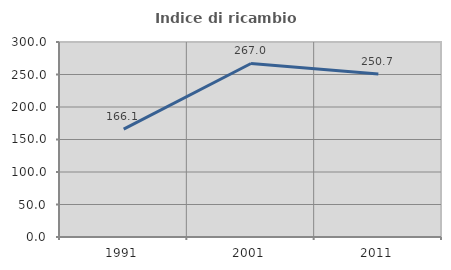
| Category | Indice di ricambio occupazionale  |
|---|---|
| 1991.0 | 166.089 |
| 2001.0 | 266.978 |
| 2011.0 | 250.725 |